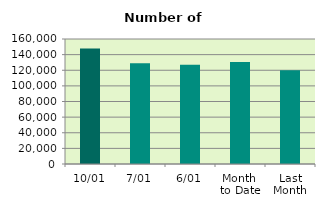
| Category | Series 0 |
|---|---|
| 10/01 | 147964 |
| 7/01 | 129016 |
| 6/01 | 126900 |
| Month 
to Date | 130563.333 |
| Last
Month | 120108.783 |